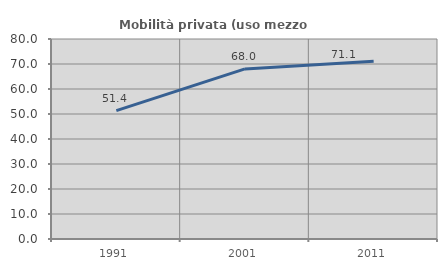
| Category | Mobilità privata (uso mezzo privato) |
|---|---|
| 1991.0 | 51.37 |
| 2001.0 | 68.041 |
| 2011.0 | 71.138 |